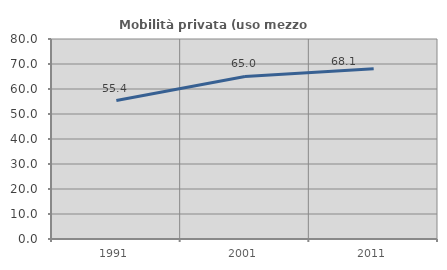
| Category | Mobilità privata (uso mezzo privato) |
|---|---|
| 1991.0 | 55.361 |
| 2001.0 | 65.009 |
| 2011.0 | 68.132 |